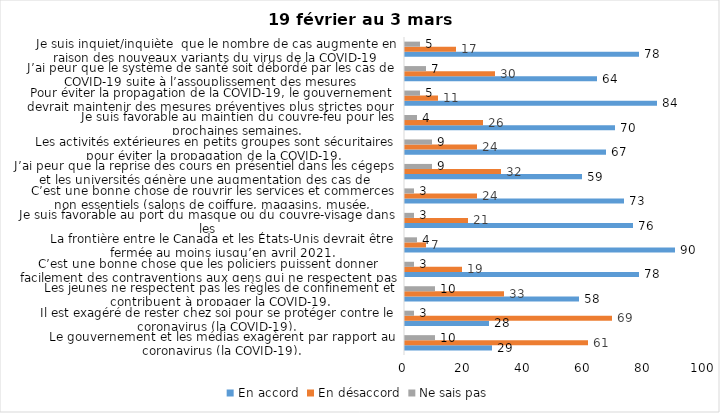
| Category | En accord | En désaccord | Ne sais pas |
|---|---|---|---|
| Le gouvernement et les médias exagèrent par rapport au coronavirus (la COVID-19). | 29 | 61 | 10 |
| Il est exagéré de rester chez soi pour se protéger contre le coronavirus (la COVID-19). | 28 | 69 | 3 |
| Les jeunes ne respectent pas les règles de confinement et contribuent à propager la COVID-19. | 58 | 33 | 10 |
| C’est une bonne chose que les policiers puissent donner facilement des contraventions aux gens qui ne respectent pas les mesures pour prévenir le coronavirus (la COVID-19). | 78 | 19 | 3 |
| La frontière entre le Canada et les États-Unis devrait être fermée au moins jusqu’en avril 2021. | 90 | 7 | 4 |
| Je suis favorable au port du masque ou du couvre-visage dans les
lieux publics extérieurs achalandés (ex. rues, parcs) | 76 | 21 | 3 |
| C’est une bonne chose de rouvrir les services et commerces non essentiels (salons de coiffure, magasins, musée, industries) à partir du 8 février 2021. | 73 | 24 | 3 |
| J’ai peur que la reprise des cours en présentiel dans les cégeps et les universités génère une augmentation des cas de COVID-19. | 59 | 32 | 9 |
| Les activités extérieures en petits groupes sont sécuritaires pour éviter la propagation de la COVID-19. | 67 | 24 | 9 |
| Je suis favorable au maintien du couvre-feu pour les prochaines semaines. | 70 | 26 | 4 |
| Pour éviter la propagation de la COVID-19, le gouvernement devrait maintenir des mesures préventives plus strictes pour la grande région de Montréal. | 84 | 11 | 5 |
| J’ai peur que le système de santé soit débordé par les cas de COVID-19 suite à l’assouplissement des mesures | 64 | 30 | 7 |
| Je suis inquiet/inquiète  que le nombre de cas augmente en raison des nouveaux variants du virus de la COVID-19 | 78 | 17 | 5 |